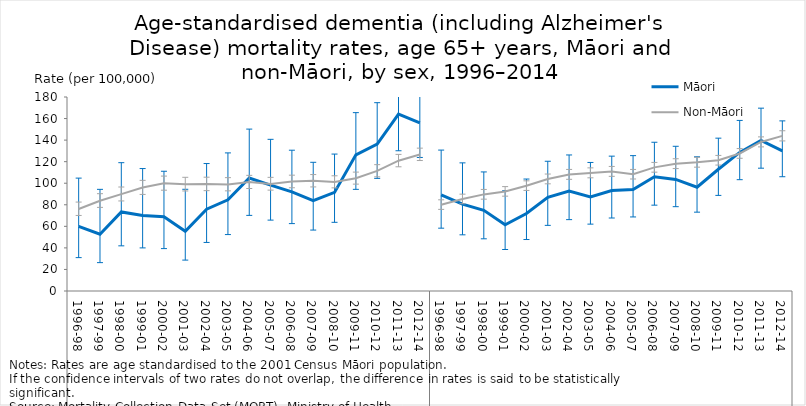
| Category | Māori | Non-Māori |
|---|---|---|
| 0 | 59.957 | 76.104 |
| 1 | 52.713 | 83.763 |
| 2 | 73.315 | 89.85 |
| 3 | 69.959 | 95.965 |
| 4 | 68.93 | 99.919 |
| 5 | 55.414 | 99.002 |
| 6 | 75.853 | 99.201 |
| 7 | 84.608 | 98.908 |
| 8 | 104.842 | 101.057 |
| 9 | 98.234 | 99.391 |
| 10 | 92.028 | 101.504 |
| 11 | 83.835 | 102.18 |
| 12 | 91.513 | 101.175 |
| 13 | 126.302 | 104.628 |
| 14 | 136.301 | 111.48 |
| 15 | 164.096 | 120.894 |
| 16 | 156.021 | 126.703 |
| 17 | 89.233 | 80.079 |
| 18 | 80.537 | 85.313 |
| 19 | 74.838 | 89.634 |
| 20 | 61.44 | 92.349 |
| 21 | 71.878 | 97.696 |
| 22 | 86.955 | 103.912 |
| 23 | 92.688 | 108.135 |
| 24 | 87.244 | 109.552 |
| 25 | 93.203 | 110.911 |
| 26 | 94.097 | 108.298 |
| 27 | 105.949 | 114.719 |
| 28 | 103.541 | 118.088 |
| 29 | 96.322 | 119.392 |
| 30 | 112.959 | 121.264 |
| 31 | 128.607 | 127.601 |
| 32 | 139.749 | 138.296 |
| 33 | 130.03 | 143.901 |